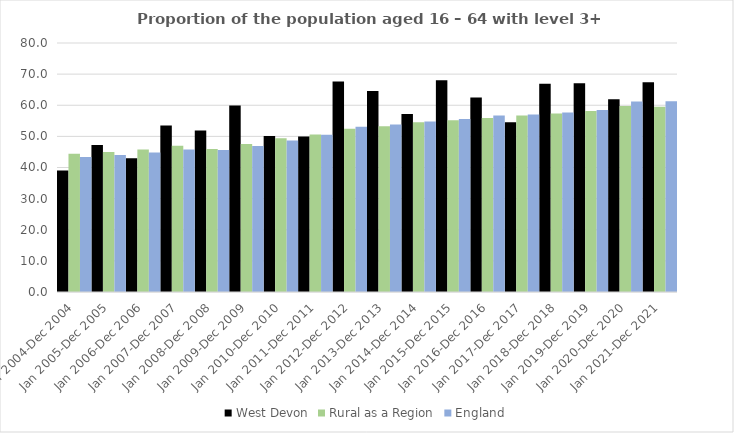
| Category | West Devon | Rural as a Region | England |
|---|---|---|---|
| Jan 2004-Dec 2004 | 39 | 44.405 | 43.4 |
| Jan 2005-Dec 2005 | 47.2 | 44.973 | 44 |
| Jan 2006-Dec 2006 | 43 | 45.774 | 44.8 |
| Jan 2007-Dec 2007 | 53.5 | 46.968 | 45.8 |
| Jan 2008-Dec 2008 | 51.9 | 45.964 | 45.6 |
| Jan 2009-Dec 2009 | 59.9 | 47.59 | 46.9 |
| Jan 2010-Dec 2010 | 50.1 | 49.362 | 48.7 |
| Jan 2011-Dec 2011 | 50 | 50.602 | 50.5 |
| Jan 2012-Dec 2012 | 67.6 | 52.439 | 53.1 |
| Jan 2013-Dec 2013 | 64.6 | 53.276 | 53.8 |
| Jan 2014-Dec 2014 | 57.2 | 54.57 | 54.8 |
| Jan 2015-Dec 2015 | 68 | 55.16 | 55.6 |
| Jan 2016-Dec 2016 | 62.5 | 55.941 | 56.7 |
| Jan 2017-Dec 2017 | 54.5 | 56.689 | 57 |
| Jan 2018-Dec 2018 | 66.9 | 57.389 | 57.7 |
| Jan 2019-Dec 2019 | 67.1 | 58.147 | 58.5 |
| Jan 2020-Dec 2020 | 61.9 | 59.771 | 61.2 |
| Jan 2021-Dec 2021 | 67.4 | 59.54 | 61.3 |